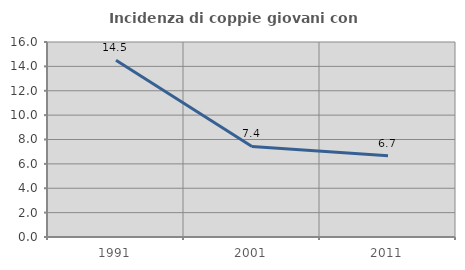
| Category | Incidenza di coppie giovani con figli |
|---|---|
| 1991.0 | 14.508 |
| 2001.0 | 7.429 |
| 2011.0 | 6.667 |